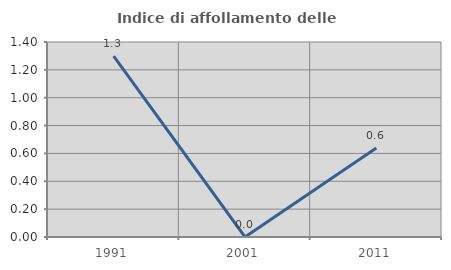
| Category | Indice di affollamento delle abitazioni  |
|---|---|
| 1991.0 | 1.299 |
| 2001.0 | 0 |
| 2011.0 | 0.639 |